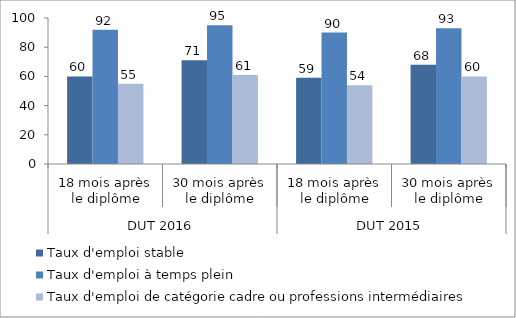
| Category | Taux d'emploi stable | Taux d'emploi à temps plein | Taux d'emploi de catégorie cadre ou professions intermédiaires |
|---|---|---|---|
| 0 | 60 | 92 | 55 |
| 1 | 71 | 95 | 61 |
| 2 | 59 | 90 | 54 |
| 3 | 68 | 93 | 60 |